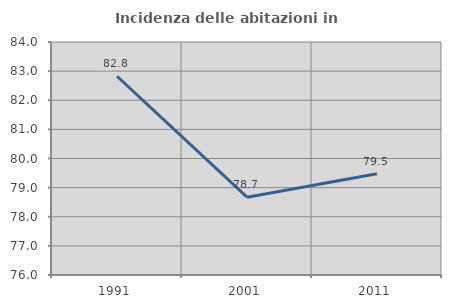
| Category | Incidenza delle abitazioni in proprietà  |
|---|---|
| 1991.0 | 82.824 |
| 2001.0 | 78.671 |
| 2011.0 | 79.473 |